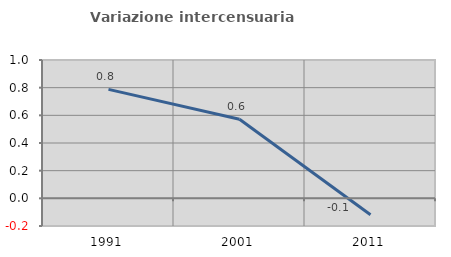
| Category | Variazione intercensuaria annua |
|---|---|
| 1991.0 | 0.788 |
| 2001.0 | 0.572 |
| 2011.0 | -0.118 |